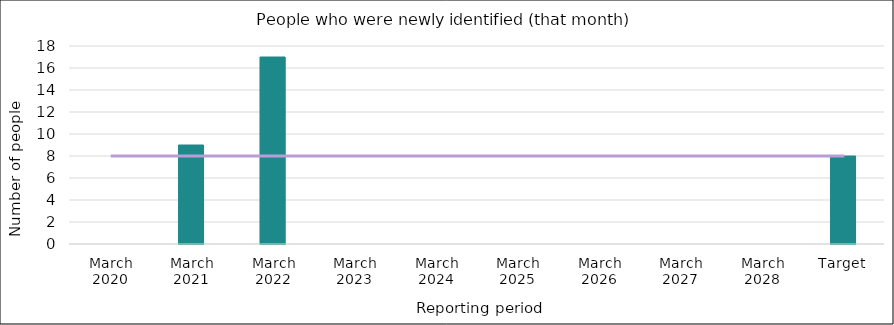
| Category | Series 0 |
|---|---|
| March 2020 | 0 |
| March 2021 | 9 |
| March 2022 | 17 |
| March 2023 | 0 |
| March 2024 | 0 |
| March 2025 | 0 |
| March 2026 | 0 |
| March 2027 | 0 |
| March 2028 | 0 |
| Target | 8 |